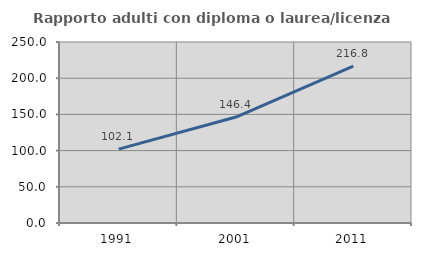
| Category | Rapporto adulti con diploma o laurea/licenza media  |
|---|---|
| 1991.0 | 102.091 |
| 2001.0 | 146.395 |
| 2011.0 | 216.829 |